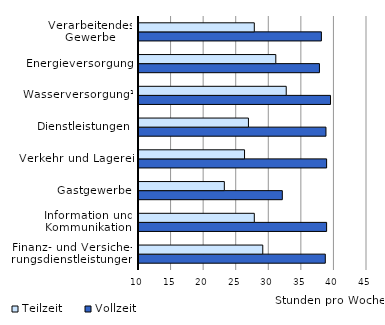
| Category | Vollzeit | Teilzeit |
|---|---|---|
| Finanz- und Versiche-
rungsdienstleistungen | 38.6 | 29 |
| Information und Kommunikation | 38.8 | 27.7 |
| Gastgewerbe | 32 | 23.1 |
| Verkehr und Lagerei | 38.8 | 26.2 |
| Dienstleistungen | 38.7 | 26.8 |
| Wasserversorgung¹ | 39.4 | 32.6 |
| Energieversorgung | 37.7 | 31 |
| Verarbeitendes Gewerbe | 38 | 27.7 |